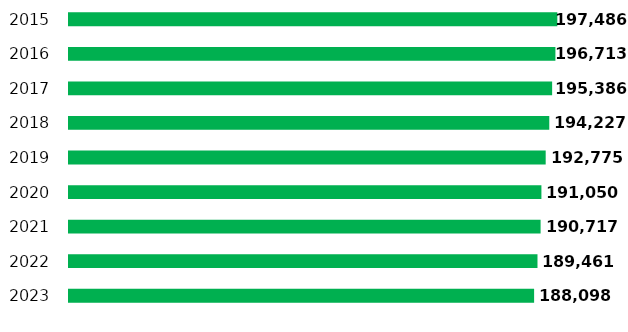
| Category | al 1° gennaio |
|---|---|
| 2023.0 | 188098 |
| 2022.0 | 189461 |
| 2021.0 | 190717 |
| 2020.0 | 191050 |
| 2019.0 | 192775 |
| 2018.0 | 194227 |
| 2017.0 | 195386 |
| 2016.0 | 196713 |
| 2015.0 | 197486 |